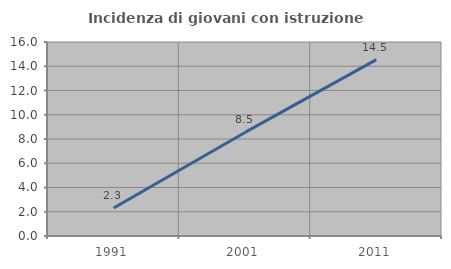
| Category | Incidenza di giovani con istruzione universitaria |
|---|---|
| 1991.0 | 2.304 |
| 2001.0 | 8.542 |
| 2011.0 | 14.549 |